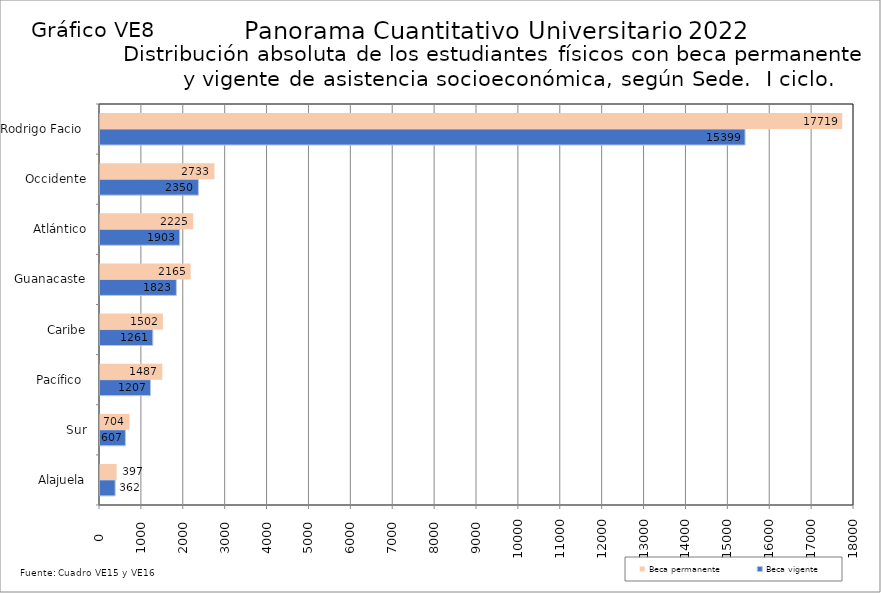
| Category | Beca vigente | Beca permanente |
|---|---|---|
| Alajuela | 362 | 397 |
| Sur | 607 | 704 |
| Pacífico  | 1207 | 1487 |
| Caribe | 1261 | 1502 |
| Guanacaste | 1823 | 2165 |
| Atlántico | 1903 | 2225 |
| Occidente | 2350 | 2733 |
| Rodrigo Facio  | 15399 | 17719 |